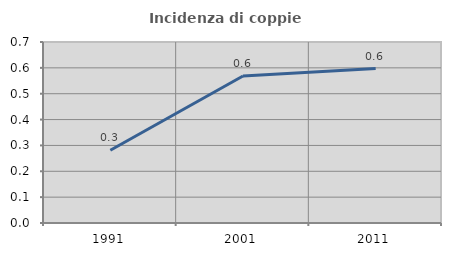
| Category | Incidenza di coppie miste |
|---|---|
| 1991.0 | 0.281 |
| 2001.0 | 0.568 |
| 2011.0 | 0.597 |